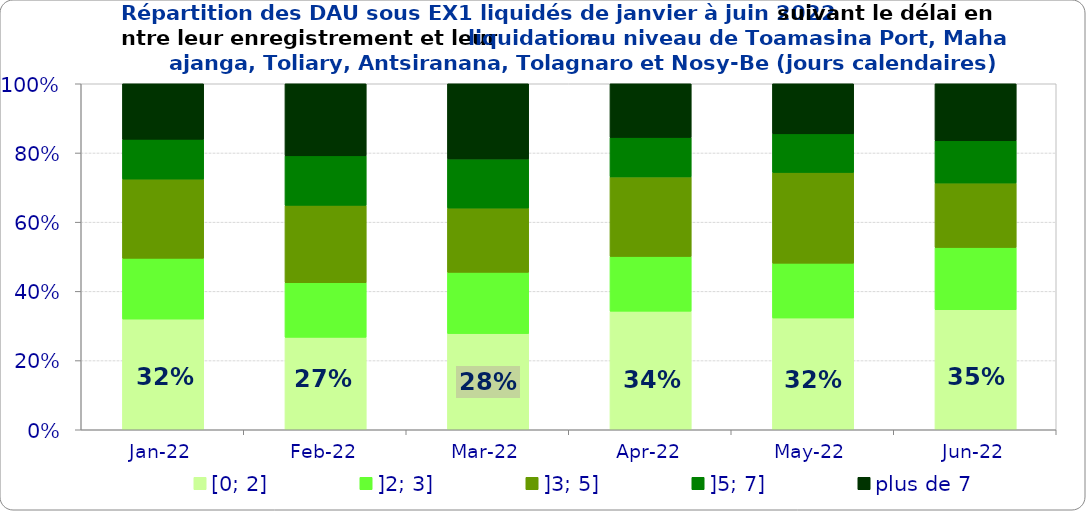
| Category | [0; 2] | ]2; 3] | ]3; 5] | ]5; 7] | plus de 7 |
|---|---|---|---|---|---|
| 2022-01-01 | 0.32 | 0.176 | 0.229 | 0.115 | 0.161 |
| 2022-02-01 | 0.267 | 0.158 | 0.223 | 0.143 | 0.208 |
| 2022-03-01 | 0.278 | 0.177 | 0.186 | 0.142 | 0.217 |
| 2022-04-01 | 0.343 | 0.158 | 0.23 | 0.114 | 0.155 |
| 2022-05-01 | 0.323 | 0.158 | 0.262 | 0.111 | 0.145 |
| 2022-06-01 | 0.347 | 0.18 | 0.186 | 0.122 | 0.165 |